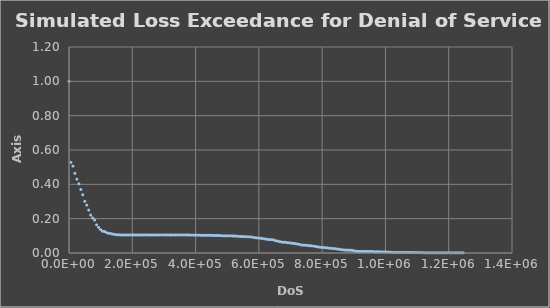
| Category | Percentage Greater |
|---|---|
| 0.0 | 1 |
| 6229.526814501622 | 0.528 |
| 12459.053629003243 | 0.506 |
| 18688.580443504863 | 0.464 |
| 24918.107258006487 | 0.43 |
| 31147.63407250811 | 0.403 |
| 37377.160887009726 | 0.37 |
| 43606.68770151135 | 0.339 |
| 49836.21451601297 | 0.301 |
| 56065.7413305146 | 0.279 |
| 62295.26814501622 | 0.25 |
| 68524.79495951784 | 0.221 |
| 74754.32177401945 | 0.204 |
| 80983.84858852108 | 0.192 |
| 87213.3754030227 | 0.164 |
| 93442.90221752433 | 0.149 |
| 99672.42903202595 | 0.136 |
| 105901.95584652756 | 0.127 |
| 112131.4826610292 | 0.125 |
| 118361.00947553081 | 0.119 |
| 124590.53629003244 | 0.115 |
| 130820.06310453406 | 0.114 |
| 137049.58991903567 | 0.11 |
| 143279.1167335373 | 0.109 |
| 149508.6435480389 | 0.106 |
| 155738.17036254055 | 0.106 |
| 161967.69717704217 | 0.105 |
| 168197.22399154378 | 0.105 |
| 174426.7508060454 | 0.105 |
| 180656.277620547 | 0.105 |
| 186885.80443504866 | 0.105 |
| 193115.33124955028 | 0.105 |
| 199344.8580640519 | 0.105 |
| 205574.3848785535 | 0.105 |
| 211803.91169305512 | 0.105 |
| 218033.43850755677 | 0.105 |
| 224262.9653220584 | 0.105 |
| 230492.49213656 | 0.105 |
| 236722.01895106162 | 0.105 |
| 242951.54576556323 | 0.105 |
| 249181.07258006488 | 0.105 |
| 255410.5993945665 | 0.105 |
| 261640.1262090681 | 0.105 |
| 267869.6530235697 | 0.105 |
| 274099.17983807134 | 0.105 |
| 280328.70665257296 | 0.105 |
| 286558.2334670746 | 0.105 |
| 292787.7602815762 | 0.105 |
| 299017.2870960778 | 0.105 |
| 305246.8139105795 | 0.105 |
| 311476.3407250811 | 0.105 |
| 317705.8675395827 | 0.105 |
| 323935.39435408433 | 0.105 |
| 330164.92116858595 | 0.105 |
| 336394.44798308756 | 0.105 |
| 342623.9747975892 | 0.105 |
| 348853.5016120908 | 0.105 |
| 355083.0284265924 | 0.105 |
| 361312.555241094 | 0.105 |
| 367542.0820555957 | 0.105 |
| 373771.6088700973 | 0.105 |
| 380001.13568459894 | 0.105 |
| 386230.66249910055 | 0.104 |
| 392460.18931360217 | 0.104 |
| 398689.7161281038 | 0.104 |
| 404919.2429426054 | 0.104 |
| 411148.769757107 | 0.104 |
| 417378.29657160863 | 0.103 |
| 423607.82338611025 | 0.103 |
| 429837.35020061187 | 0.103 |
| 436066.87701511354 | 0.103 |
| 442296.40382961516 | 0.103 |
| 448525.9306441168 | 0.103 |
| 454755.4574586184 | 0.102 |
| 460984.98427312 | 0.102 |
| 467214.5110876216 | 0.102 |
| 473444.03790212324 | 0.102 |
| 479673.56471662485 | 0.101 |
| 485903.09153112647 | 0.1 |
| 492132.6183456281 | 0.1 |
| 498362.14516012976 | 0.1 |
| 504591.6719746314 | 0.1 |
| 510821.198789133 | 0.1 |
| 517050.7256036346 | 0.099 |
| 523280.2524181362 | 0.099 |
| 529509.7792326378 | 0.098 |
| 535739.3060471395 | 0.097 |
| 541968.8328616411 | 0.096 |
| 548198.3596761427 | 0.096 |
| 554427.8864906443 | 0.095 |
| 560657.4133051459 | 0.095 |
| 566886.9401196475 | 0.094 |
| 573116.4669341492 | 0.094 |
| 579345.9937486508 | 0.092 |
| 585575.5205631524 | 0.09 |
| 591805.047377654 | 0.088 |
| 598034.5741921556 | 0.087 |
| 604264.1010066574 | 0.086 |
| 610493.627821159 | 0.085 |
| 616723.1546356606 | 0.082 |
| 622952.6814501622 | 0.081 |
| 629182.2082646638 | 0.079 |
| 635411.7350791654 | 0.078 |
| 641641.261893667 | 0.078 |
| 647870.7887081687 | 0.075 |
| 654100.3155226703 | 0.071 |
| 660329.8423371719 | 0.069 |
| 666559.3691516735 | 0.066 |
| 672788.8959661751 | 0.063 |
| 679018.4227806767 | 0.063 |
| 685247.9495951784 | 0.062 |
| 691477.47640968 | 0.06 |
| 697707.0032241816 | 0.059 |
| 703936.5300386832 | 0.057 |
| 710166.0568531848 | 0.056 |
| 716395.5836676864 | 0.054 |
| 722625.110482188 | 0.052 |
| 728854.6372966897 | 0.05 |
| 735084.1641111914 | 0.046 |
| 741313.690925693 | 0.046 |
| 747543.2177401946 | 0.045 |
| 753772.7445546963 | 0.044 |
| 760002.2713691979 | 0.042 |
| 766231.7981836995 | 0.042 |
| 772461.3249982011 | 0.04 |
| 778690.8518127027 | 0.038 |
| 784920.3786272043 | 0.036 |
| 791149.905441706 | 0.034 |
| 797379.4322562076 | 0.033 |
| 803608.9590707092 | 0.032 |
| 809838.4858852108 | 0.031 |
| 816068.0126997124 | 0.03 |
| 822297.539514214 | 0.028 |
| 828527.0663287156 | 0.027 |
| 834756.5931432173 | 0.026 |
| 840986.1199577189 | 0.025 |
| 847215.6467722205 | 0.023 |
| 853445.1735867221 | 0.022 |
| 859674.7004012237 | 0.02 |
| 865904.2272157255 | 0.018 |
| 872133.7540302271 | 0.017 |
| 878363.2808447287 | 0.017 |
| 884592.8076592303 | 0.016 |
| 890822.3344737319 | 0.016 |
| 897051.8612882335 | 0.015 |
| 903281.3881027352 | 0.011 |
| 909510.9149172368 | 0.01 |
| 915740.4417317384 | 0.009 |
| 921969.96854624 | 0.009 |
| 928199.4953607416 | 0.009 |
| 934429.0221752432 | 0.009 |
| 940658.5489897449 | 0.009 |
| 946888.0758042465 | 0.009 |
| 953117.6026187481 | 0.009 |
| 959347.1294332497 | 0.009 |
| 965576.6562477513 | 0.007 |
| 971806.1830622529 | 0.007 |
| 978035.7098767546 | 0.007 |
| 984265.2366912562 | 0.007 |
| 990494.7635057578 | 0.006 |
| 996724.2903202595 | 0.006 |
| 1002953.8171347611 | 0.006 |
| 1009183.3439492628 | 0.005 |
| 1015412.8707637644 | 0.005 |
| 1021642.397578266 | 0.004 |
| 1027871.9243927676 | 0.003 |
| 1034101.4512072692 | 0.003 |
| 1040330.9780217708 | 0.003 |
| 1046560.5048362724 | 0.003 |
| 1052790.031650774 | 0.003 |
| 1059019.5584652757 | 0.003 |
| 1065249.0852797774 | 0.003 |
| 1071478.612094279 | 0.003 |
| 1077708.1389087806 | 0.003 |
| 1083937.6657232821 | 0.003 |
| 1090167.1925377839 | 0.003 |
| 1096396.7193522854 | 0.002 |
| 1102626.246166787 | 0.002 |
| 1108855.7729812886 | 0.002 |
| 1115085.2997957903 | 0.002 |
| 1121314.8266102918 | 0.001 |
| 1127544.3534247936 | 0.001 |
| 1133773.880239295 | 0.001 |
| 1140003.4070537968 | 0.001 |
| 1146232.9338682983 | 0.001 |
| 1152462.4606828 | 0.001 |
| 1158691.9874973015 | 0.001 |
| 1164921.5143118033 | 0.001 |
| 1171151.0411263048 | 0.001 |
| 1177380.5679408065 | 0.001 |
| 1183610.094755308 | 0.001 |
| 1189839.6215698097 | 0.001 |
| 1196069.1483843112 | 0.001 |
| 1202298.675198813 | 0.001 |
| 1208528.2020133147 | 0.001 |
| 1214757.7288278162 | 0.001 |
| 1220987.255642318 | 0.001 |
| 1227216.7824568194 | 0.001 |
| 1233446.3092713212 | 0.001 |
| 1239675.8360858227 | 0.001 |
| 1245905.3629003244 | 0.001 |